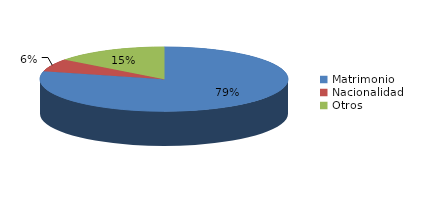
| Category | Series 0 |
|---|---|
| Matrimonio | 1534 |
| Nacionalidad | 122 |
| Otros | 286 |